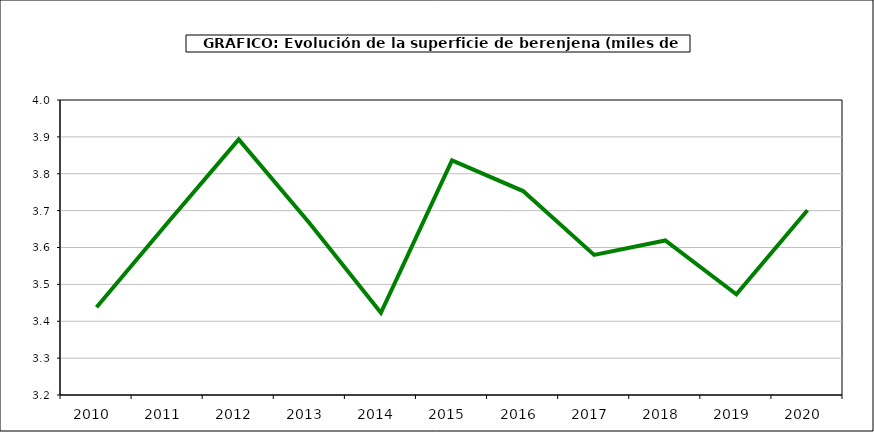
| Category | superficie |
|---|---|
| 2010.0 | 3.438 |
| 2011.0 | 3.667 |
| 2012.0 | 3.893 |
| 2013.0 | 3.665 |
| 2014.0 | 3.423 |
| 2015.0 | 3.836 |
| 2016.0 | 3.753 |
| 2017.0 | 3.58 |
| 2018.0 | 3.619 |
| 2019.0 | 3.473 |
| 2020.0 | 3.701 |